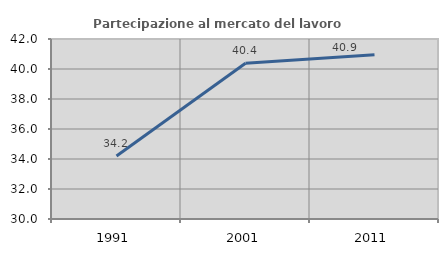
| Category | Partecipazione al mercato del lavoro  femminile |
|---|---|
| 1991.0 | 34.195 |
| 2001.0 | 40.383 |
| 2011.0 | 40.943 |